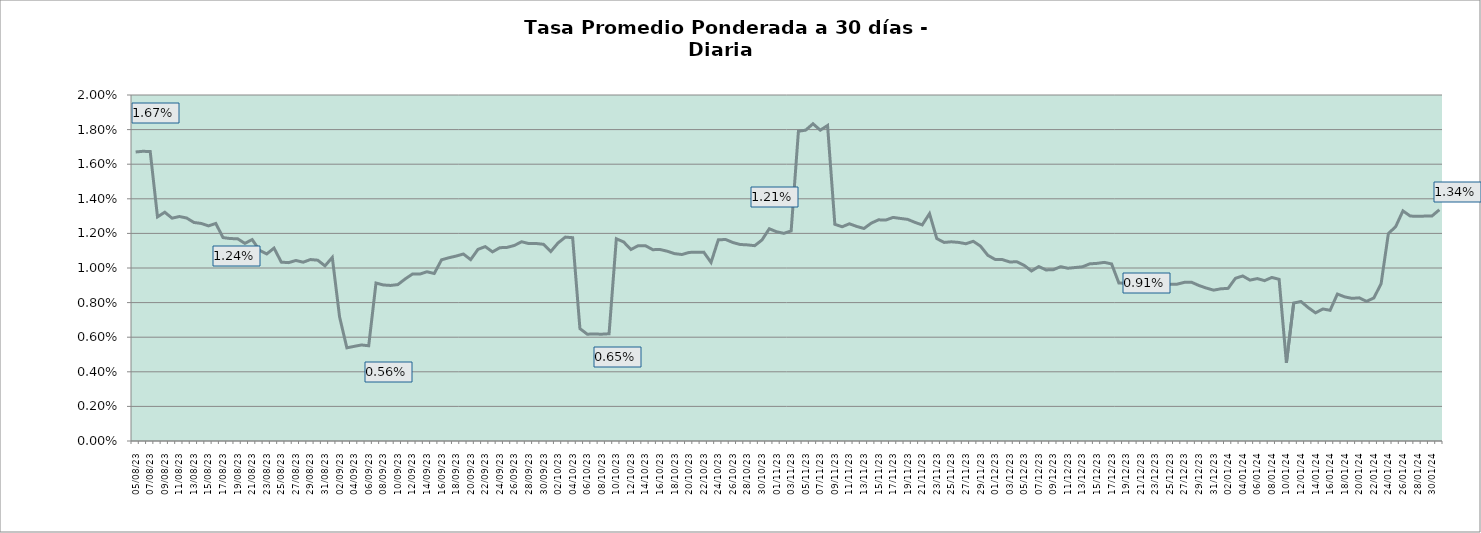
| Category | Tasa a 30 días |
|---|---|
| 2023-08-05 | 0.017 |
| 2023-08-06 | 0.017 |
| 2023-08-07 | 0.017 |
| 2023-08-08 | 0.013 |
| 2023-08-09 | 0.013 |
| 2023-08-10 | 0.013 |
| 2023-08-11 | 0.013 |
| 2023-08-12 | 0.013 |
| 2023-08-13 | 0.013 |
| 2023-08-14 | 0.013 |
| 2023-08-15 | 0.012 |
| 2023-08-16 | 0.013 |
| 2023-08-17 | 0.012 |
| 2023-08-18 | 0.012 |
| 2023-08-19 | 0.012 |
| 2023-08-20 | 0.011 |
| 2023-08-21 | 0.012 |
| 2023-08-22 | 0.011 |
| 2023-08-23 | 0.011 |
| 2023-08-24 | 0.011 |
| 2023-08-25 | 0.01 |
| 2023-08-26 | 0.01 |
| 2023-08-27 | 0.01 |
| 2023-08-28 | 0.01 |
| 2023-08-29 | 0.01 |
| 2023-08-30 | 0.01 |
| 2023-08-31 | 0.01 |
| 2023-09-01 | 0.011 |
| 2023-09-02 | 0.007 |
| 2023-09-03 | 0.005 |
| 2023-09-04 | 0.005 |
| 2023-09-05 | 0.006 |
| 2023-09-06 | 0.006 |
| 2023-09-07 | 0.009 |
| 2023-09-08 | 0.009 |
| 2023-09-09 | 0.009 |
| 2023-09-10 | 0.009 |
| 2023-09-11 | 0.009 |
| 2023-09-12 | 0.01 |
| 2023-09-13 | 0.01 |
| 2023-09-14 | 0.01 |
| 2023-09-15 | 0.01 |
| 2023-09-16 | 0.01 |
| 2023-09-17 | 0.011 |
| 2023-09-18 | 0.011 |
| 2023-09-19 | 0.011 |
| 2023-09-20 | 0.01 |
| 2023-09-21 | 0.011 |
| 2023-09-22 | 0.011 |
| 2023-09-23 | 0.011 |
| 2023-09-24 | 0.011 |
| 2023-09-25 | 0.011 |
| 2023-09-26 | 0.011 |
| 2023-09-27 | 0.012 |
| 2023-09-28 | 0.011 |
| 2023-09-29 | 0.011 |
| 2023-09-30 | 0.011 |
| 2023-10-01 | 0.011 |
| 2023-10-02 | 0.011 |
| 2023-10-03 | 0.012 |
| 2023-10-04 | 0.012 |
| 2023-10-05 | 0.006 |
| 2023-10-06 | 0.006 |
| 2023-10-07 | 0.006 |
| 2023-10-08 | 0.006 |
| 2023-10-09 | 0.006 |
| 2023-10-10 | 0.012 |
| 2023-10-11 | 0.012 |
| 2023-10-12 | 0.011 |
| 2023-10-13 | 0.011 |
| 2023-10-14 | 0.011 |
| 2023-10-15 | 0.011 |
| 2023-10-16 | 0.011 |
| 2023-10-17 | 0.011 |
| 2023-10-18 | 0.011 |
| 2023-10-19 | 0.011 |
| 2023-10-20 | 0.011 |
| 2023-10-21 | 0.011 |
| 2023-10-22 | 0.011 |
| 2023-10-23 | 0.01 |
| 2023-10-24 | 0.012 |
| 2023-10-25 | 0.012 |
| 2023-10-26 | 0.011 |
| 2023-10-27 | 0.011 |
| 2023-10-28 | 0.011 |
| 2023-10-29 | 0.011 |
| 2023-10-30 | 0.012 |
| 2023-10-31 | 0.012 |
| 2023-11-01 | 0.012 |
| 2023-11-02 | 0.012 |
| 2023-11-03 | 0.012 |
| 2023-11-04 | 0.018 |
| 2023-11-05 | 0.018 |
| 2023-11-06 | 0.018 |
| 2023-11-07 | 0.018 |
| 2023-11-08 | 0.018 |
| 2023-11-09 | 0.013 |
| 2023-11-10 | 0.012 |
| 2023-11-11 | 0.013 |
| 2023-11-12 | 0.012 |
| 2023-11-13 | 0.012 |
| 2023-11-14 | 0.013 |
| 2023-11-15 | 0.013 |
| 2023-11-16 | 0.013 |
| 2023-11-17 | 0.013 |
| 2023-11-18 | 0.013 |
| 2023-11-19 | 0.013 |
| 2023-11-20 | 0.013 |
| 2023-11-21 | 0.012 |
| 2023-11-22 | 0.013 |
| 2023-11-23 | 0.012 |
| 2023-11-24 | 0.011 |
| 2023-11-25 | 0.012 |
| 2023-11-26 | 0.011 |
| 2023-11-27 | 0.011 |
| 2023-11-28 | 0.012 |
| 2023-11-29 | 0.011 |
| 2023-11-30 | 0.011 |
| 2023-12-01 | 0.01 |
| 2023-12-02 | 0.01 |
| 2023-12-03 | 0.01 |
| 2023-12-04 | 0.01 |
| 2023-12-05 | 0.01 |
| 2023-12-06 | 0.01 |
| 2023-12-07 | 0.01 |
| 2023-12-08 | 0.01 |
| 2023-12-09 | 0.01 |
| 2023-12-10 | 0.01 |
| 2023-12-11 | 0.01 |
| 2023-12-12 | 0.01 |
| 2023-12-13 | 0.01 |
| 2023-12-14 | 0.01 |
| 2023-12-15 | 0.01 |
| 2023-12-16 | 0.01 |
| 2023-12-17 | 0.01 |
| 2023-12-18 | 0.009 |
| 2023-12-19 | 0.009 |
| 2023-12-20 | 0.009 |
| 2023-12-21 | 0.009 |
| 2023-12-22 | 0.009 |
| 2023-12-23 | 0.009 |
| 2023-12-24 | 0.009 |
| 2023-12-25 | 0.009 |
| 2023-12-26 | 0.009 |
| 2023-12-27 | 0.009 |
| 2023-12-28 | 0.009 |
| 2023-12-29 | 0.009 |
| 2023-12-30 | 0.009 |
| 2023-12-31 | 0.009 |
| 2024-01-01 | 0.009 |
| 2024-01-02 | 0.009 |
| 2024-01-03 | 0.009 |
| 2024-01-04 | 0.01 |
| 2024-01-05 | 0.009 |
| 2024-01-06 | 0.009 |
| 2024-01-07 | 0.009 |
| 2024-01-08 | 0.009 |
| 2024-01-09 | 0.009 |
| 2024-01-10 | 0.005 |
| 2024-01-11 | 0.008 |
| 2024-01-12 | 0.008 |
| 2024-01-13 | 0.008 |
| 2024-01-14 | 0.007 |
| 2024-01-15 | 0.008 |
| 2024-01-16 | 0.008 |
| 2024-01-17 | 0.008 |
| 2024-01-18 | 0.008 |
| 2024-01-19 | 0.008 |
| 2024-01-20 | 0.008 |
| 2024-01-21 | 0.008 |
| 2024-01-22 | 0.008 |
| 2024-01-23 | 0.009 |
| 2024-01-24 | 0.012 |
| 2024-01-25 | 0.012 |
| 2024-01-26 | 0.013 |
| 2024-01-27 | 0.013 |
| 2024-01-28 | 0.013 |
| 2024-01-29 | 0.013 |
| 2024-01-30 | 0.013 |
| 2024-01-31 | 0.013 |